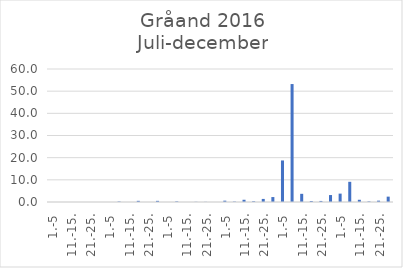
| Category | Series 0 |
|---|---|
| 1.-5 | 0 |
| 6.-10. | 0 |
| 11.-15. | 0 |
| 16.-20. | 0 |
| 21.-25. | 0 |
| 26.-31. | 0 |
| 1.-5 | 0 |
| 6.-10. | 0.221 |
| 11.-15. | 0 |
| 16.-20. | 0.525 |
| 21.-25. | 0 |
| 26.-31. | 0.515 |
| 1.-5 | 0 |
| 6.-10. | 0.279 |
| 11.-15. | 0 |
| 16.-20. | 0.084 |
| 21.-25. | 0.064 |
| 26.-30. | 0 |
| 1.-5 | 0.603 |
| 6.-10. | 0.193 |
| 11.-15. | 1.012 |
| 16.-20. | 0.336 |
| 21.-25. | 1.387 |
| 26.-31. | 2.23 |
| 1.-5 | 18.743 |
| 6.-10. | 53.212 |
| 11.-15. | 3.688 |
| 16.-20. | 0.453 |
| 21.-25. | 0.476 |
| 26.-30. | 3.137 |
| 1.-5 | 3.78 |
| 6.-10. | 9.111 |
| 11.-15. | 1.004 |
| 16.-20. | 0.257 |
| 21.-25. | 0.606 |
| 26.-31. | 2.419 |